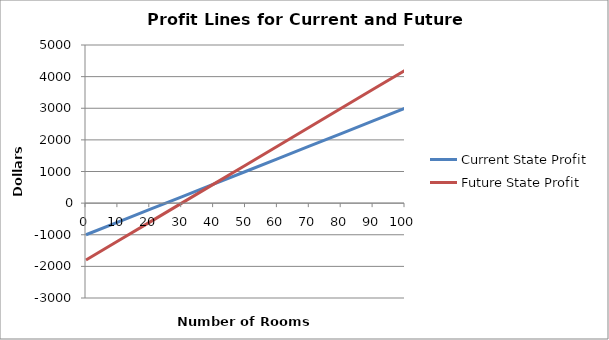
| Category | Current State Profit | Future State Profit |
|---|---|---|
| 0.0 | -1000 | -1800 |
| 10.0 | -600 | -1200 |
| 20.0 | -200 | -600 |
| 30.0 | 200 | 0 |
| 40.0 | 600 | 600 |
| 50.0 | 1000 | 1200 |
| 60.0 | 1400 | 1800 |
| 70.0 | 1800 | 2400 |
| 80.0 | 2200 | 3000 |
| 90.0 | 2600 | 3600 |
| 100.0 | 3000 | 4200 |